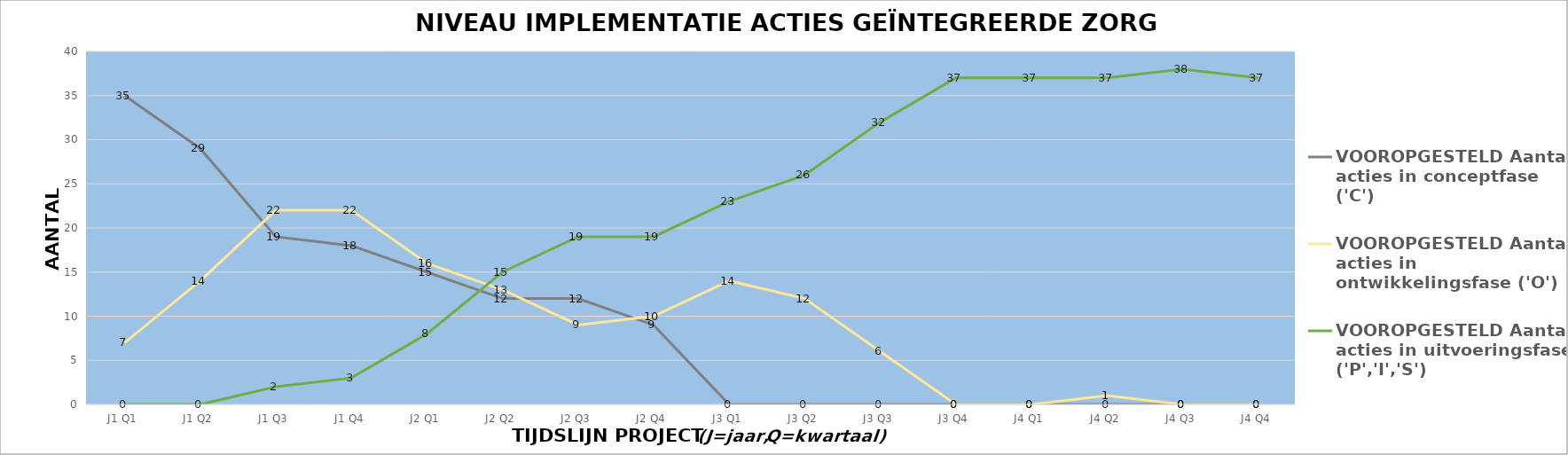
| Category | VOOROPGESTELD Aantal acties in conceptfase ('C') | VOOROPGESTELD Aantal acties in ontwikkelingsfase ('O') | VOOROPGESTELD Aantal acties in uitvoeringsfase ('P','I','S') |
|---|---|---|---|
| J1 Q1 | 35 | 7 | 0 |
| J1 Q2 | 29 | 14 | 0 |
| J1 Q3 | 19 | 22 | 2 |
| J1 Q4 | 18 | 22 | 3 |
| J2 Q1 | 15 | 16 | 8 |
| J2 Q2 | 12 | 13 | 15 |
| J2 Q3 | 12 | 9 | 19 |
| J2 Q4 | 9 | 10 | 19 |
| J3 Q1 | 0 | 14 | 23 |
| J3 Q2 | 0 | 12 | 26 |
| J3 Q3 | 0 | 6 | 32 |
| J3 Q4 | 0 | 0 | 37 |
| J4 Q1 | 0 | 0 | 37 |
| J4 Q2 | 0 | 1 | 37 |
| J4 Q3 | 0 | 0 | 38 |
| J4 Q4 | 0 | 0 | 37 |